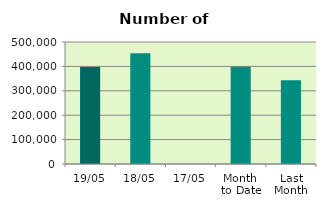
| Category | Series 0 |
|---|---|
| 19/05 | 397766 |
| 18/05 | 453746 |
| 17/05 | 2 |
| Month 
to Date | 399068 |
| Last
Month | 343067.2 |